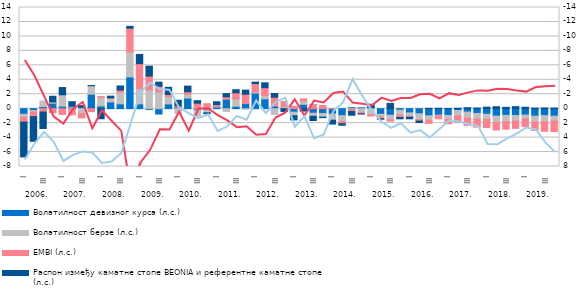
| Category | Волатилност девизног курса (л.с.) | Волатилност берзе (л.с.) | EMBI (л.с.) | Распон између каматне стопе BEONIA и референтне каматне стопе (л.с.) |
|---|---|---|---|---|
| 0 | -0.78 | -0.4 | -0.671 | -4.821 |
| 1 | -0.256 | -0.205 | -0.64 | -3.415 |
| 2 | 0.291 | 0.788 | -0.461 | -2.281 |
| 3 | 0.751 | 0.174 | -0.568 | 0.79 |
| 4 | 0.342 | 1.58 | -0.798 | 1 |
| 5 | 0.202 | 0.125 | -0.858 | 0.639 |
| 6 | 0.256 | -0.661 | -0.617 | 0.169 |
| 7 | 2.016 | 1.167 | -0.413 | 0.016 |
| 8 | 0.381 | 1.213 | 0.09 | -1.394 |
| 9 | 0.938 | 0.493 | 0.072 | 0.23 |
| 10 | 0.672 | 1.614 | 0.293 | 0.567 |
| 11 | 4.393 | 3.436 | 3.313 | 0.248 |
| 12 | 0.667 | 2.114 | 3.447 | 1.275 |
| 13 | -0.122 | 2.582 | 1.93 | 1.37 |
| 14 | -0.741 | 2.347 | 0.751 | 0.571 |
| 15 | 0.656 | 1.035 | 0.285 | 0.982 |
| 16 | 0.216 | -0.667 | 0.178 | 0.77 |
| 17 | 1.472 | 0.515 | 0.347 | 0.786 |
| 18 | -0.214 | -0.818 | 0.765 | 0.343 |
| 19 | -0.204 | -0.369 | 0.688 | -0.119 |
| 20 | 0.255 | 0.011 | 0.295 | 0.398 |
| 21 | 1.304 | -0.392 | 0.347 | 0.44 |
| 22 | 0.332 | 1.002 | 0.867 | 0.424 |
| 23 | 0.703 | -0.06 | 1.3 | 0.56 |
| 24 | 2.159 | 0.165 | 1.152 | 0.194 |
| 25 | 1.361 | 0.459 | 1.088 | 0.668 |
| 26 | 0.363 | -0.804 | 1.221 | 0.521 |
| 27 | 0.005 | 0.302 | 0.7 | -0.383 |
| 28 | -0.48 | -0.499 | 0.331 | -0.579 |
| 29 | 0.604 | 0.452 | 0.307 | -0.331 |
| 30 | -0.618 | -0.432 | 0.574 | -0.584 |
| 31 | -0.671 | -0.497 | 0.443 | -0.069 |
| 32 | -0.748 | -0.85 | 0.026 | -0.527 |
| 33 | -0.956 | -0.825 | -0.288 | -0.222 |
| 34 | 0.136 | -0.115 | -0.281 | -0.51 |
| 35 | 0.12 | -0.55 | -0.158 | -0.024 |
| 36 | 0.154 | -0.84 | -0.184 | 0.459 |
| 37 | -0.774 | -0.366 | -0.26 | -0.059 |
| 38 | -0.907 | -0.628 | -0.186 | 0.731 |
| 39 | -0.221 | -0.658 | -0.335 | -0.188 |
| 40 | -0.58 | -0.484 | -0.119 | -0.22 |
| 41 | -0.704 | -0.789 | -0.217 | -0.202 |
| 42 | -0.984 | -0.627 | -0.428 | 0.042 |
| 43 | -0.899 | -0.097 | -0.4 | 0.046 |
| 44 | -0.935 | -0.533 | -0.629 | 0.016 |
| 45 | -0.248 | -0.753 | -0.868 | 0.054 |
| 46 | -0.474 | -0.838 | -1.01 | 0.131 |
| 47 | -0.655 | -0.773 | -1.121 | 0.086 |
| 48 | -0.776 | -0.688 | -1.145 | 0.21 |
| 49 | -1.029 | -0.891 | -1.035 | 0.268 |
| 50 | -0.929 | -0.84 | -1.072 | 0.183 |
| 51 | -0.939 | -0.762 | -1.021 | 0.28 |
| 52 | -0.878 | -0.55 | -1.061 | 0.195 |
| 53 | -1.03 | -0.821 | -1.161 | 0.082 |
| 54 | -0.964 | -0.84 | -1.322 | 0.097 |
| 55 | -1.033 | -0.652 | -1.486 | 0.083 |